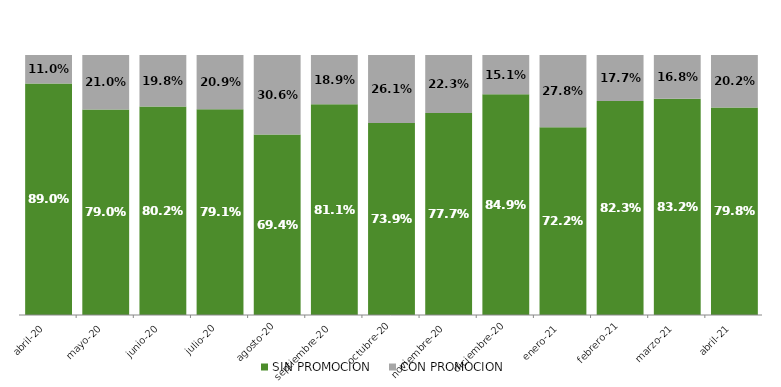
| Category | SIN PROMOCION   | CON PROMOCION   |
|---|---|---|
| 2020-04-01 | 0.89 | 0.11 |
| 2020-05-01 | 0.79 | 0.21 |
| 2020-06-01 | 0.802 | 0.198 |
| 2020-07-01 | 0.791 | 0.209 |
| 2020-08-01 | 0.694 | 0.306 |
| 2020-09-01 | 0.811 | 0.189 |
| 2020-10-01 | 0.739 | 0.261 |
| 2020-11-01 | 0.777 | 0.223 |
| 2020-12-01 | 0.849 | 0.151 |
| 2021-01-01 | 0.722 | 0.278 |
| 2021-02-01 | 0.823 | 0.177 |
| 2021-03-01 | 0.832 | 0.168 |
| 2021-04-01 | 0.798 | 0.202 |